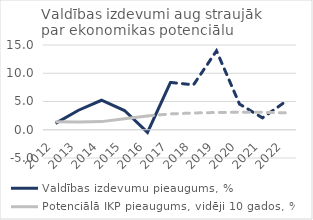
| Category | Valdības izdevumu pieaugums, % | Potenciālā IKP pieaugums, vidēji 10 gados, % |
|---|---|---|
| 2012 | 1.127 | 1.41 |
| 2013 | 3.456 | 1.359 |
| 2014 | 5.221 | 1.439 |
| 2015 | 3.403 | 1.938 |
| 2016 | -0.463 | 2.446 |
| 2017 | 8.379 | 2.802 |
| 2018 | 7.948 | 2.966 |
| 2019 | 13.966 | 3.055 |
| 2020 | 4.547 | 3.1 |
| 2021 | 2.102 | 3.091 |
| 2022 | 4.981 | 3 |